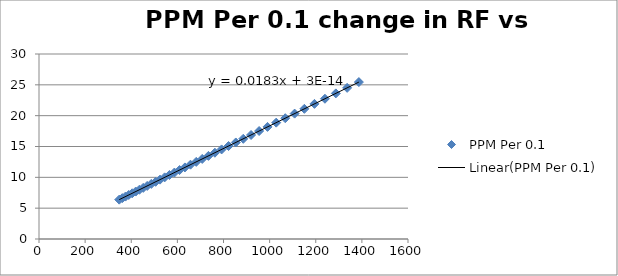
| Category | PPM Per 0.1  |
|---|---|
| 347.8936824258307 | 6.382 |
| 361.14380266566025 | 6.625 |
| 374.89857618101274 | 6.877 |
| 389.1772235467877 | 7.139 |
| 403.9996973860397 | 7.411 |
| 419.3867102512734 | 7.694 |
| 435.359763567643 | 7.987 |
| 451.9411776785039 | 8.291 |
| 469.15412303529985 | 8.606 |
| 487.0226525753694 | 8.934 |
| 505.57173533291603 | 9.275 |
| 524.8272913301095 | 9.628 |
| 544.8162277970732 | 9.994 |
| 565.5664767713719 | 10.375 |
| 587.1070341295385 | 10.77 |
| 609.4680001051844 | 11.18 |
| 632.6806213503081 | 11.606 |
| 656.777334598583 | 12.048 |
| 681.7918119916333 | 12.507 |
| 707.7590081316391 | 12.984 |
| 734.7152089260184 | 13.478 |
| 762.6980822924432 | 13.991 |
| 791.7467307950409 | 14.524 |
| 821.9017462853346 | 15.078 |
| 853.2052666242769 | 15.652 |
| 885.7010345646381 | 16.248 |
| 919.4344588760293 | 16.867 |
| 954.4526777979762 | 17.509 |
| 990.8046249097113 | 18.176 |
| 1028.5410975087264 | 18.868 |
| 1067.7148275936422 | 19.587 |
| 1108.3805555505755 | 20.333 |
| 1150.5951066459816 | 21.107 |
| 1194.417470432852 | 21.911 |
| 1239.908883181235 | 22.746 |
| 1287.1329134482598 | 23.612 |
| 1336.1555509072411 | 24.511 |
| 1387.0452985599914 | 25.445 |